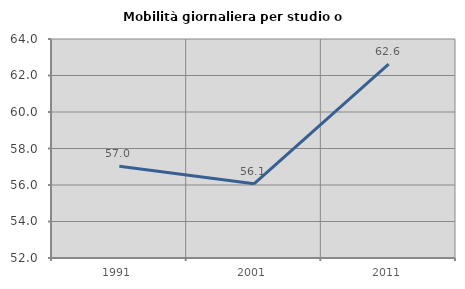
| Category | Mobilità giornaliera per studio o lavoro |
|---|---|
| 1991.0 | 57.027 |
| 2001.0 | 56.067 |
| 2011.0 | 62.617 |